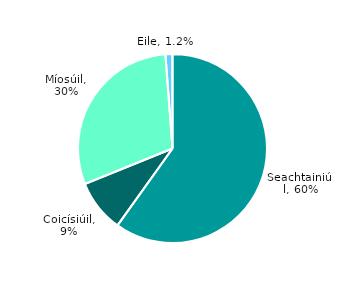
| Category | Series 0 |
|---|---|
| Seachtainiúil | 0.6 |
| Coicísiúil | 0.09 |
| Míosúil | 0.3 |
| Eile | 0.012 |